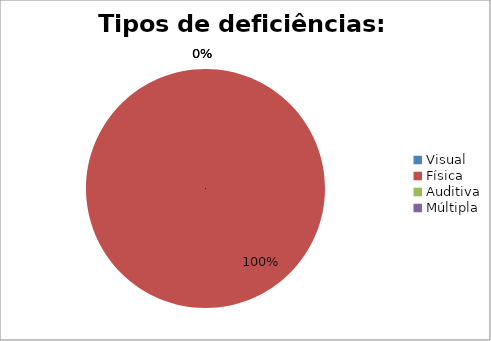
| Category | Tipos de deficiências: Quantitativo |
|---|---|
| Visual | 0 |
| Física | 2 |
| Auditiva | 0 |
| Múltipla | 0 |